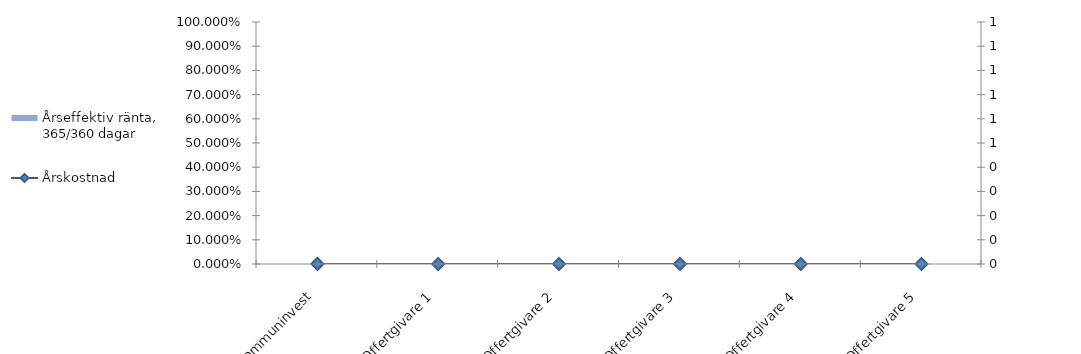
| Category | Årseffektiv ränta, 365/360 dagar |
|---|---|
| Kommuninvest | 0 |
| Offertgivare 1 | 0 |
| Offertgivare 2 | 0 |
| Offertgivare 3 | 0 |
| Offertgivare 4 | 0 |
| Offertgivare 5 | 0 |